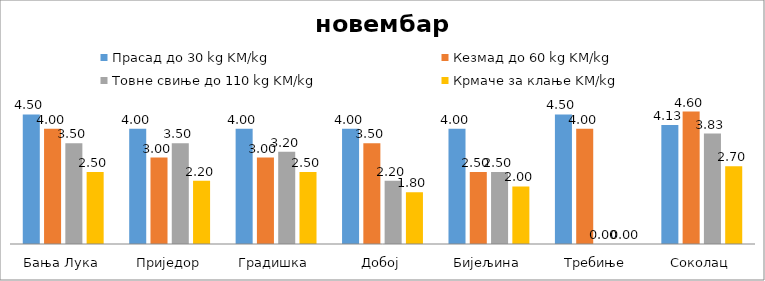
| Category | Прасад до 30 kg KM/kg | Кезмад до 60 kg KM/kg | Товне свиње до 110 kg KM/kg | Крмаче за клање KM/kg |
|---|---|---|---|---|
| Бања Лука | 4.5 | 4 | 3.5 | 2.5 |
| Приједор | 4 | 3 | 3.5 | 2.2 |
| Градишка | 4 | 3 | 3.2 | 2.5 |
| Добој | 4 | 3.5 | 2.2 | 1.8 |
| Бијељина | 4 | 2.5 | 2.5 | 2 |
|  Требиње | 4.5 | 4 | 0 | 0 |
| Соколац | 4.133 | 4.6 | 3.833 | 2.7 |